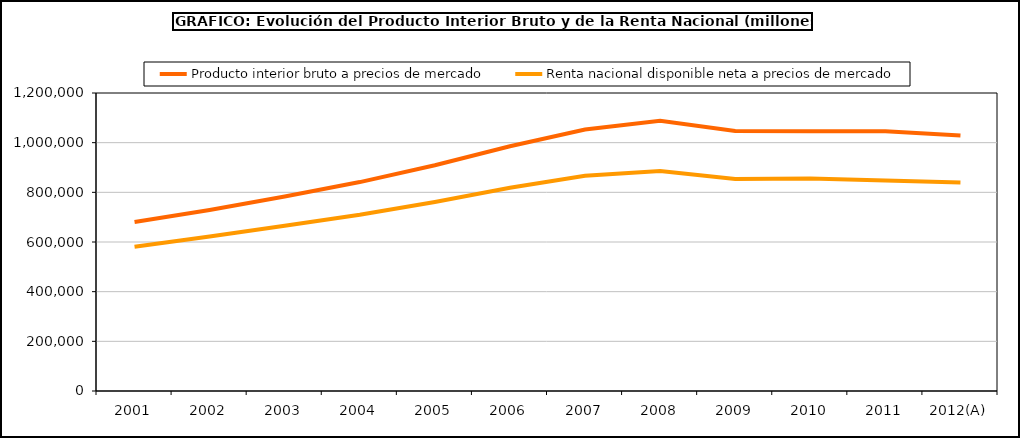
| Category | Producto interior bruto a precios de mercado | Renta nacional disponible neta a precios de mercado |
|---|---|---|
| 2001 | 680397 | 581084 |
| 2002 | 729258 | 621881 |
| 2003 | 783082 | 665216 |
| 2004 | 841294 | 709618 |
| 2005 | 909298 | 761276 |
| 2006 | 985547 | 818469 |
| 2007 | 1053161 | 866968 |
| 2008 | 1087788 | 885491 |
| 2009 | 1046894 | 853421 |
| 2010 | 1045620 | 855747 |
| 2011 | 1046327 | 847281 |
| 2012(A) | 1029279 | 839928 |